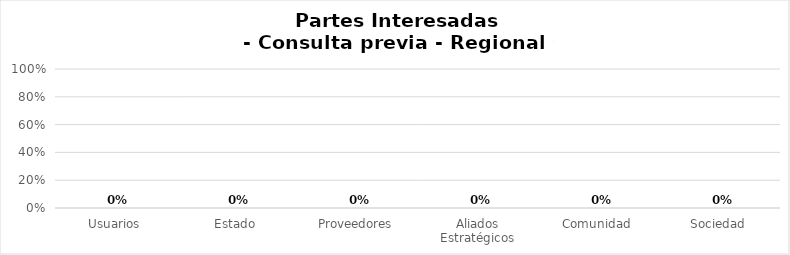
| Category | Tipo de organización - Consulta previa - Regional 0 / 0 |
|---|---|
| Usuarios | 0 |
| Estado | 0 |
| Proveedores | 0 |
| Aliados Estratégicos | 0 |
| Comunidad | 0 |
| Sociedad | 0 |